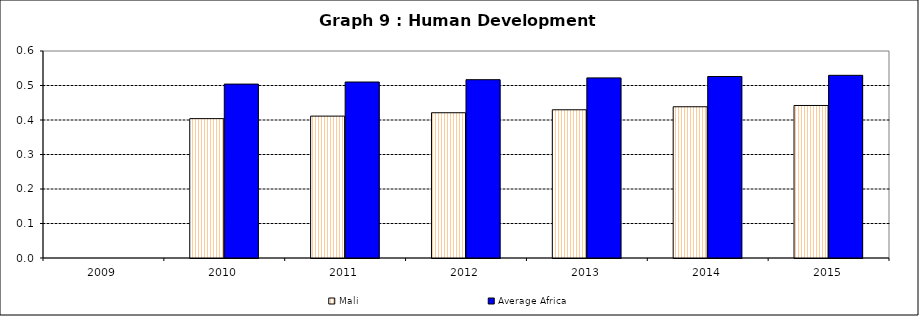
| Category | Mali | Average Africa |
|---|---|---|
| 2009.0 | 0 | 0 |
| 2010.0 | 0.404 | 0.504 |
| 2011.0 | 0.411 | 0.51 |
| 2012.0 | 0.421 | 0.517 |
| 2013.0 | 0.43 | 0.522 |
| 2014.0 | 0.438 | 0.526 |
| 2015.0 | 0.442 | 0.53 |